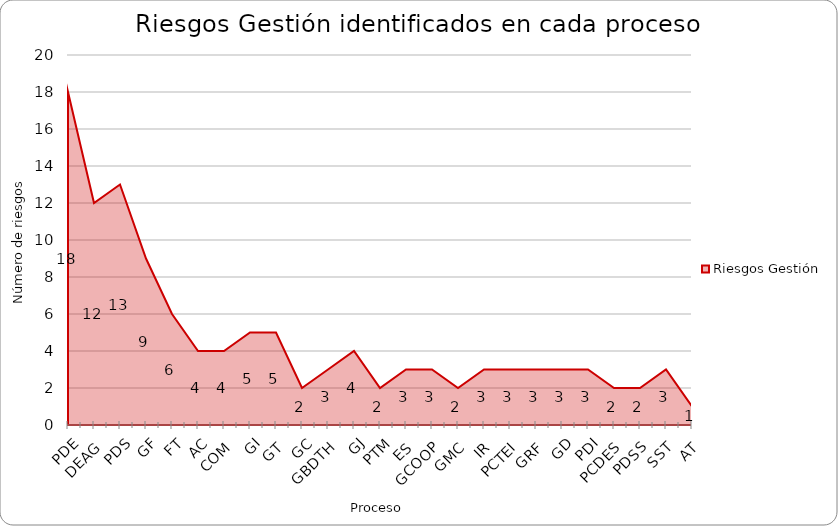
| Category | Riesgos Gestión |
|---|---|
| PDE | 18 |
| DEAG | 12 |
| PDS | 13 |
| GF | 9 |
| FT | 6 |
| AC | 4 |
| COM | 4 |
| GI | 5 |
| GT | 5 |
| GC | 2 |
| GBDTH | 3 |
| GJ | 4 |
| PTM | 2 |
| ES | 3 |
| GCOOP | 3 |
| GMC | 2 |
| IR | 3 |
| PCTEI | 3 |
| GRF | 3 |
| GD | 3 |
| PDI | 3 |
| PCDES | 2 |
| PDSS | 2 |
| SST | 3 |
| AT | 1 |